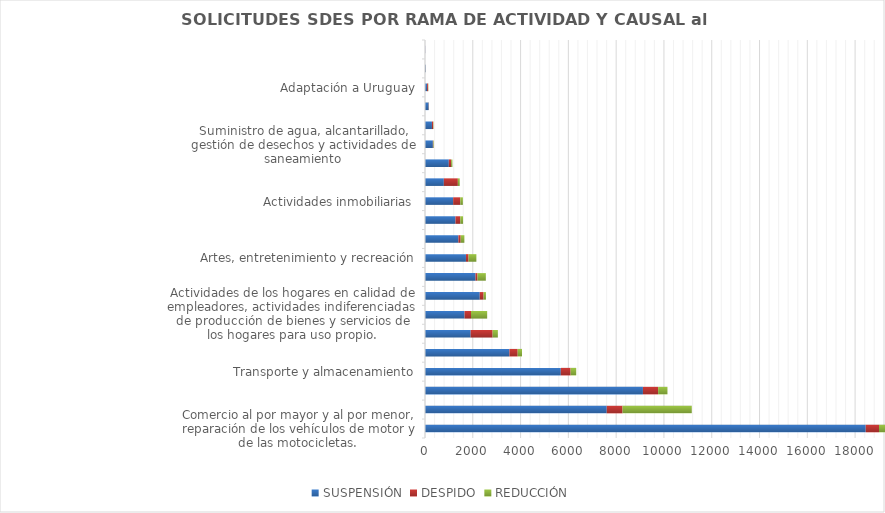
| Category | SUSPENSIÓN | DESPIDO | REDUCCIÓN |
|---|---|---|---|
| Comercio al por mayor y al por menor, reparación de los vehículos de motor y de las motocicletas. | 18444 | 1008 | 438 |
| Industrias Manufactureras | 7606 | 661 | 2898 |
| Alojamiento y servicios de comida | 9121 | 635 | 391 |
| Transporte y almacenamiento | 5683 | 411 | 234 |
| Actividades administrativas y servicios de apoyo | 3533 | 346 | 180 |
| Construcción | 1911 | 919 | 219 |
| Actividades de los hogares en calidad de empleadores, actividades indiferenciadas de producción de bienes y servicios de los hogares para uso propio. | 1656 | 269 | 677 |
| Otras actividades de servicio | 2292 | 160 | 98 |
| Enseñanza | 2113 | 84 | 349 |
| Artes, entretenimiento y recreación | 1714 | 109 | 327 |
| Servicios sociales y relacionados con la Salud humana. | 1397 | 96 | 155 |
| Actividades profesionales, científicas y técnicas | 1275 | 202 | 116 |
| Actividades inmobiliarias | 1178 | 299 | 108 |
| Producción agropecuaria, forestación y pesca | 789 | 586 | 78 |
| Informática y comunicación | 997 | 96 | 54 |
| Suministro de agua, alcantarillado, gestión de desechos y actividades de saneamiento | 329 | 19 | 20 |
| Actividades financieras y de seguros. | 291 | 52 | 13 |
| Explotación de minas y canteras | 153 | 8 | 3 |
| Adaptación a Uruguay | 88 | 42 | 10 |
| Administración pública y defensa, planes de seguridad social de afiliación obligatoria. | 28 | 6 | 4 |
| Suministro de electricidad, gas, vapor y aire acondicionado | 8 | 3 | 0 |